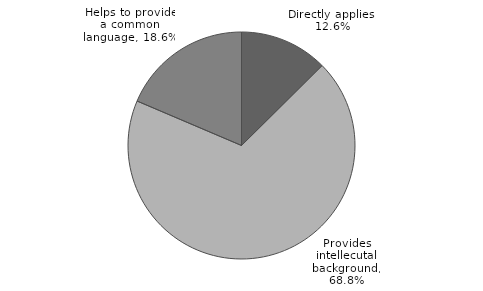
| Category | Series 0 |
|---|---|
| Directly applies | 0.126 |
| Provides intellecutal background | 0.688 |
| Helps to provide a common language | 0.186 |